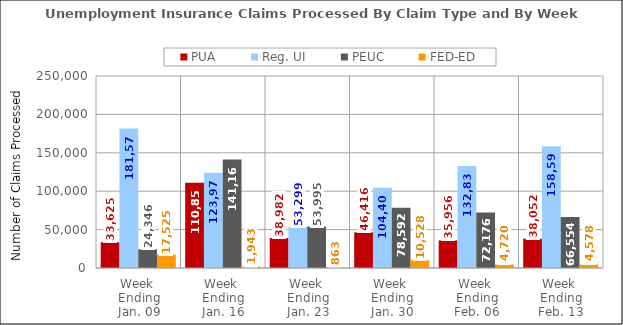
| Category | PUA | Reg. UI | PEUC | FED-ED |
|---|---|---|---|---|
| Week 
Ending
Jan. 09 | 33625 | 181576 | 24346 | 17525 |
| Week 
Ending
Jan. 16 | 110857 | 123970 | 141166 | 1943 |
| Week 
Ending
Jan. 23 | 38982 | 53298.9 | 53995 | 863 |
| Week 
Ending
Jan. 30 | 46416 | 104409 | 78592 | 10528 |
| Week 
Ending
Feb. 06 | 35956 | 132838.75 | 72176 | 4720 |
| Week 
Ending
Feb. 13 | 38052 | 158596.417 | 66554 | 4578 |